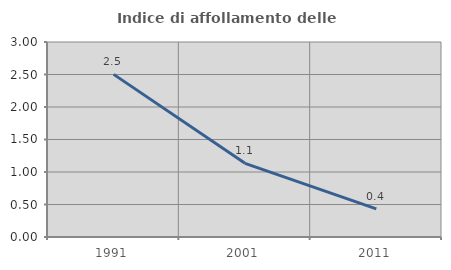
| Category | Indice di affollamento delle abitazioni  |
|---|---|
| 1991.0 | 2.502 |
| 2001.0 | 1.134 |
| 2011.0 | 0.432 |